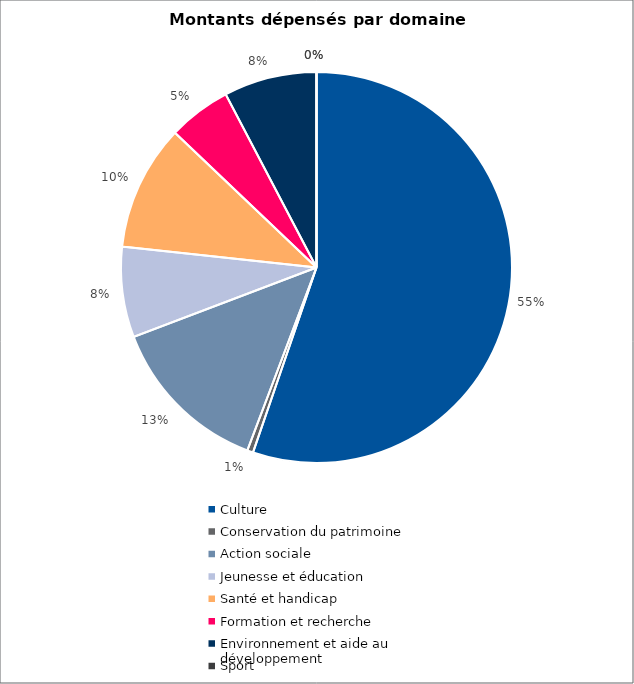
| Category | Series 0 |
|---|---|
| Culture | 20292090 |
| Conservation du patrimoine | 181000 |
| Action sociale | 4946700 |
| Jeunesse et éducation | 2747500 |
| Santé et handicap | 3819500 |
| Formation et recherche | 1912000 |
| Environnement et aide au
développement | 2821500 |
| Sport | 0 |
| Autres projets d’utilité publique | 0 |